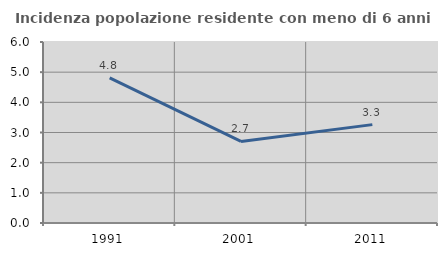
| Category | Incidenza popolazione residente con meno di 6 anni |
|---|---|
| 1991.0 | 4.808 |
| 2001.0 | 2.703 |
| 2011.0 | 3.261 |